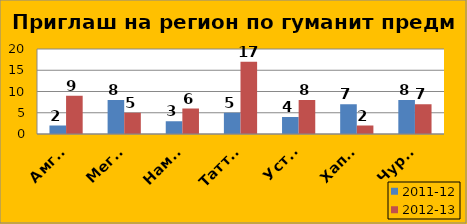
| Category | 2011-12 | 2012-13 |
|---|---|---|
| Амгинский | 2 | 9 |
| Мегино-Кангаласс | 8 | 5 |
| Намский | 3 | 6 |
| Таттинский | 5 | 17 |
| Усть-Алданский | 4 | 8 |
| Хапгаласский | 7 | 2 |
| Чурапчинский | 8 | 7 |